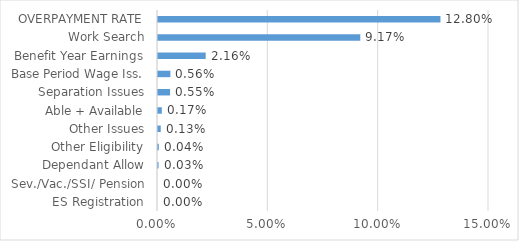
| Category | Series 0 |
|---|---|
| ES Registration | 0 |
| Sev./Vac./SSI/ Pension | 0 |
| Dependant Allow | 0 |
| Other Eligibility | 0 |
| Other Issues | 0.001 |
| Able + Available | 0.002 |
| Separation Issues | 0.005 |
| Base Period Wage Iss. | 0.006 |
| Benefit Year Earnings | 0.022 |
| Work Search | 0.092 |
| OVERPAYMENT RATE | 0.128 |